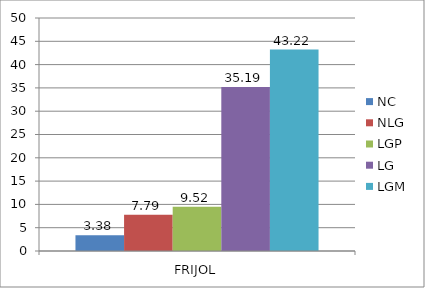
| Category | NC | NLG | LGP | LG | LGM |
|---|---|---|---|---|---|
| 0 | 3.38 | 7.79 | 9.52 | 35.19 | 43.22 |